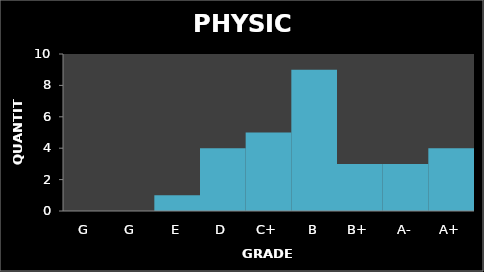
| Category | Quantity |
|---|---|
| G | 0 |
| G | 0 |
| E | 1 |
| D | 4 |
| C+ | 5 |
| B | 9 |
| B+ | 3 |
| A- | 3 |
| A+ | 4 |